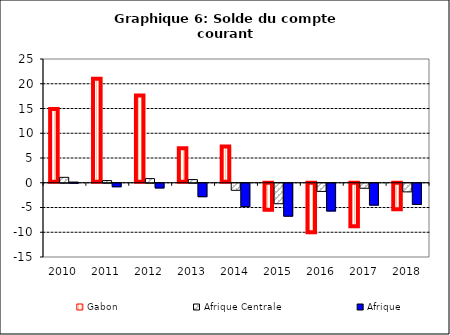
| Category | Gabon | Afrique Centrale | Afrique |
|---|---|---|---|
| 2010.0 | 14.904 | 1.095 | 0.144 |
| 2011.0 | 21.017 | 0.439 | -0.706 |
| 2012.0 | 17.641 | 0.839 | -0.95 |
| 2013.0 | 6.994 | 0.638 | -2.715 |
| 2014.0 | 7.316 | -1.429 | -4.722 |
| 2015.0 | -5.653 | -4.138 | -6.65 |
| 2016.0 | -10.211 | -1.65 | -5.608 |
| 2017.0 | -9.002 | -1.011 | -4.418 |
| 2018.0 | -5.57 | -1.744 | -4.278 |